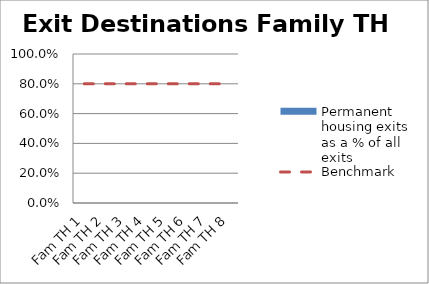
| Category | Permanent housing exits as a % of all exits |
|---|---|
| Fam TH 1 | 0 |
| Fam TH 2 | 0 |
| Fam TH 3 | 0 |
| Fam TH 4 | 0 |
| Fam TH 5 | 0 |
| Fam TH 6 | 0 |
| Fam TH 7 | 0 |
| Fam TH 8 | 0 |